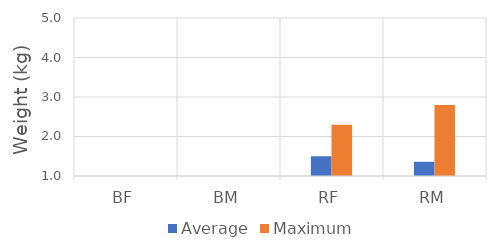
| Category | Average | Maximum |
|---|---|---|
| BF | 0 | 0 |
| BM | 0 | 0 |
| RF | 1.5 | 2.3 |
| RM | 1.36 | 2.8 |